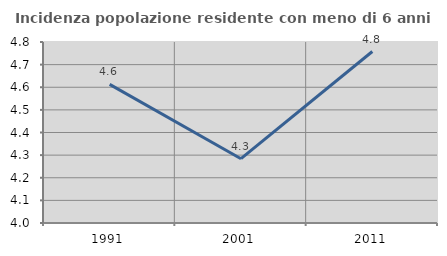
| Category | Incidenza popolazione residente con meno di 6 anni |
|---|---|
| 1991.0 | 4.613 |
| 2001.0 | 4.284 |
| 2011.0 | 4.758 |